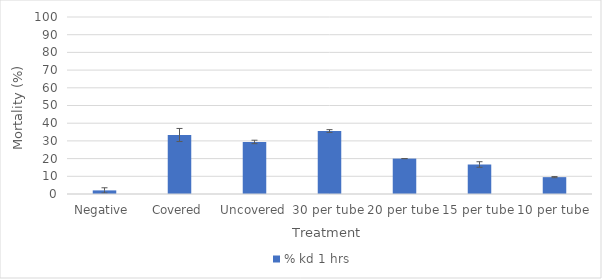
| Category | % kd 1 hrs |
|---|---|
| Negative  | 2.041 |
| Covered | 33.333 |
| Uncovered | 29.412 |
| 30 per tube | 35.593 |
| 20 per tube | 20 |
| 15 per tube | 16.667 |
| 10 per tube | 9.524 |